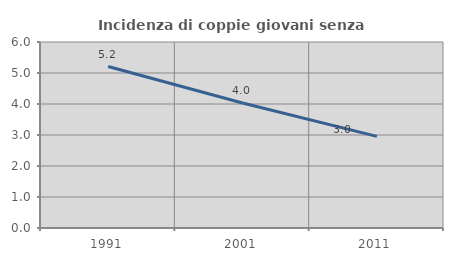
| Category | Incidenza di coppie giovani senza figli |
|---|---|
| 1991.0 | 5.208 |
| 2001.0 | 4.03 |
| 2011.0 | 2.956 |